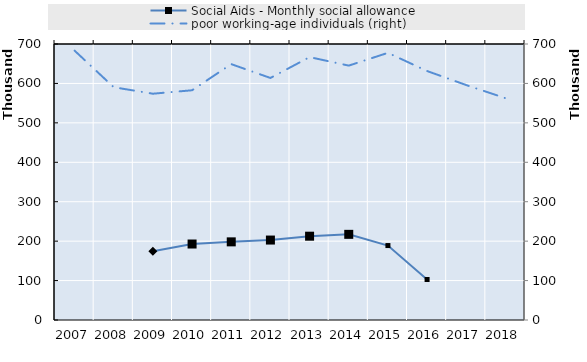
| Category | Series 0 | Social Aids - Monthly social allowance | Series 4 | Series 5 | Series 6 | Series 7 | Series 8 | Series 9 | Series 10 | Series 11 | Series 12 | Series 13 | Series 14 | Series 15 | Series 16 | Series 17 | Series 18 | Series 19 |
|---|---|---|---|---|---|---|---|---|---|---|---|---|---|---|---|---|---|---|
| 2007.0 |  | 0 |  |  |  |  |  |  |  |  |  |  |  |  |  |  |  |  |
| 2008.0 |  | 0 |  |  |  |  |  |  |  |  |  |  |  |  |  |  |  |  |
| 2009.0 |  | 174460 |  |  |  |  |  |  |  |  |  |  |  |  |  |  |  |  |
| 2010.0 |  | 192709 |  |  |  |  |  |  |  |  |  |  |  |  |  |  |  |  |
| 2011.0 |  | 198180 |  |  |  |  |  |  |  |  |  |  |  |  |  |  |  |  |
| 2012.0 |  | 202758 |  |  |  |  |  |  |  |  |  |  |  |  |  |  |  |  |
| 2013.0 |  | 212553 |  |  |  |  |  |  |  |  |  |  |  |  |  |  |  |  |
| 2014.0 |  | 217248 |  |  |  |  |  |  |  |  |  |  |  |  |  |  |  |  |
| 2015.0 |  | 188811 |  |  |  |  |  |  |  |  |  |  |  |  |  |  |  |  |
| 2016.0 |  | 102744 |  |  |  |  |  |  |  |  |  |  |  |  |  |  |  |  |
| 2017.0 |  | 0 |  |  |  |  |  |  |  |  |  |  |  |  |  |  |  |  |
| 2018.0 |  | 0 |  |  |  |  |  |  |  |  |  |  |  |  |  |  |  |  |